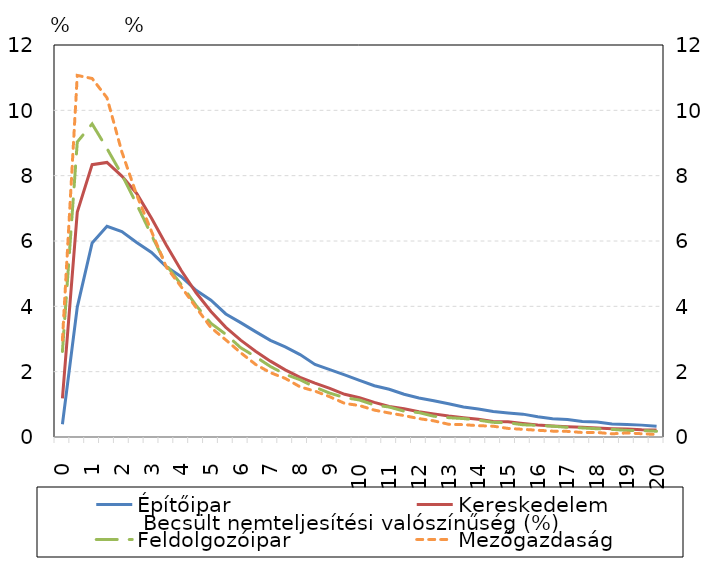
| Category | Építőipar | Kereskedelem | Feldolgozóipar |
|---|---|---|---|
| 0.0 | 0.392 | 1.181 | 2.618 |
| 0.5 | 3.978 | 6.887 | 9.032 |
| 1.0 | 5.941 | 8.337 | 9.583 |
| 1.5 | 6.452 | 8.406 | 8.831 |
| 2.0 | 6.29 | 7.989 | 8.03 |
| 2.5 | 5.956 | 7.456 | 7.125 |
| 3.0 | 5.649 | 6.697 | 6.175 |
| 3.5 | 5.212 | 5.868 | 5.26 |
| 4.0 | 4.905 | 5.096 | 4.663 |
| 4.5 | 4.489 | 4.414 | 4.027 |
| 5.0 | 4.187 | 3.844 | 3.479 |
| 5.5 | 3.768 | 3.357 | 3.144 |
| 6.0 | 3.502 | 2.964 | 2.733 |
| 6.5 | 3.226 | 2.625 | 2.458 |
| 7.0 | 2.96 | 2.322 | 2.159 |
| 7.5 | 2.757 | 2.055 | 1.919 |
| 8.0 | 2.524 | 1.825 | 1.753 |
| 8.5 | 2.223 | 1.648 | 1.525 |
| 9.0 | 2.064 | 1.487 | 1.343 |
| 9.5 | 1.902 | 1.308 | 1.207 |
| 10.0 | 1.735 | 1.203 | 1.132 |
| 10.5 | 1.569 | 1.061 | 0.98 |
| 11.0 | 1.46 | 0.936 | 0.917 |
| 11.5 | 1.309 | 0.862 | 0.791 |
| 12.0 | 1.195 | 0.775 | 0.747 |
| 12.5 | 1.112 | 0.708 | 0.636 |
| 13.0 | 1.017 | 0.64 | 0.592 |
| 13.5 | 0.919 | 0.589 | 0.564 |
| 14.0 | 0.855 | 0.542 | 0.517 |
| 14.5 | 0.78 | 0.474 | 0.448 |
| 15.0 | 0.737 | 0.467 | 0.436 |
| 15.5 | 0.7 | 0.413 | 0.375 |
| 16.0 | 0.618 | 0.369 | 0.357 |
| 16.5 | 0.56 | 0.34 | 0.33 |
| 17.0 | 0.535 | 0.314 | 0.296 |
| 17.5 | 0.478 | 0.296 | 0.278 |
| 18.0 | 0.46 | 0.279 | 0.252 |
| 18.5 | 0.401 | 0.256 | 0.233 |
| 19.0 | 0.386 | 0.242 | 0.202 |
| 19.5 | 0.364 | 0.219 | 0.199 |
| 20.0 | 0.332 | 0.218 | 0.176 |